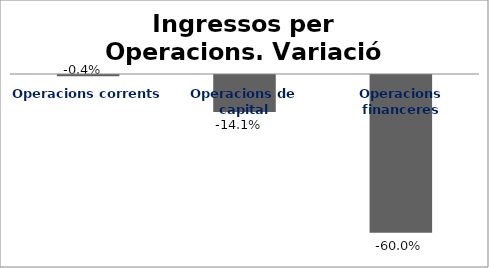
| Category | Series 0 |
|---|---|
| Operacions corrents | -0.004 |
| Operacions de capital | -0.141 |
| Operacions financeres | -0.6 |